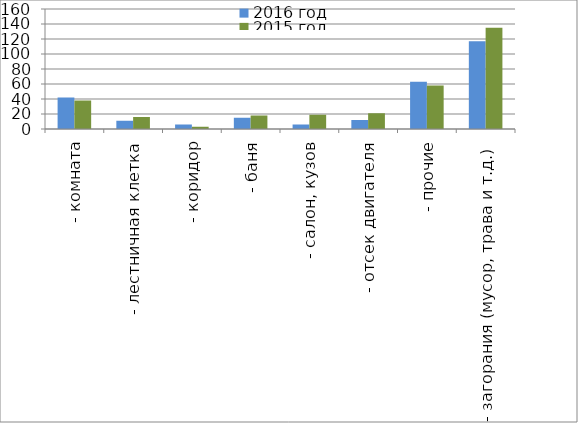
| Category | 2016 год | 2015 год |
|---|---|---|
|  - комната | 42 | 38 |
|  - лестничная клетка | 11 | 16 |
|  - коридор | 6 | 3 |
|  - баня | 15 | 18 |
|  - салон, кузов | 6 | 19 |
|  - отсек двигателя | 12 | 21 |
| - прочие | 63 | 58 |
| - загорания (мусор, трава и т.д.)  | 117 | 135 |